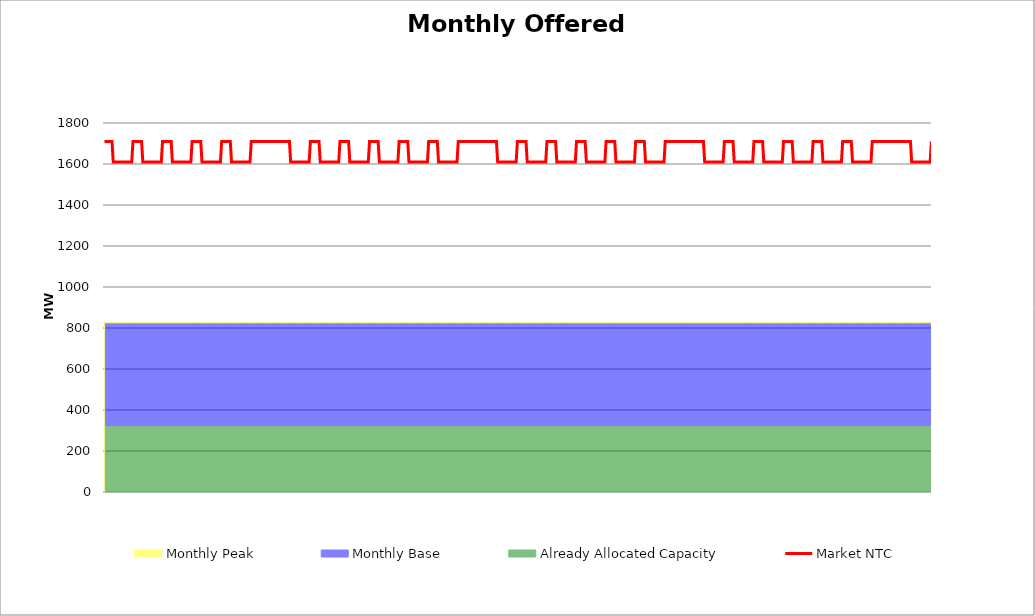
| Category | Market NTC |
|---|---|
| 0 | 1710 |
| 1 | 1710 |
| 2 | 1710 |
| 3 | 1710 |
| 4 | 1710 |
| 5 | 1710 |
| 6 | 1710 |
| 7 | 1610 |
| 8 | 1610 |
| 9 | 1610 |
| 10 | 1610 |
| 11 | 1610 |
| 12 | 1610 |
| 13 | 1610 |
| 14 | 1610 |
| 15 | 1610 |
| 16 | 1610 |
| 17 | 1610 |
| 18 | 1610 |
| 19 | 1610 |
| 20 | 1610 |
| 21 | 1610 |
| 22 | 1610 |
| 23 | 1710 |
| 24 | 1710 |
| 25 | 1710 |
| 26 | 1710 |
| 27 | 1710 |
| 28 | 1710 |
| 29 | 1710 |
| 30 | 1710 |
| 31 | 1610 |
| 32 | 1610 |
| 33 | 1610 |
| 34 | 1610 |
| 35 | 1610 |
| 36 | 1610 |
| 37 | 1610 |
| 38 | 1610 |
| 39 | 1610 |
| 40 | 1610 |
| 41 | 1610 |
| 42 | 1610 |
| 43 | 1610 |
| 44 | 1610 |
| 45 | 1610 |
| 46 | 1610 |
| 47 | 1710 |
| 48 | 1710 |
| 49 | 1710 |
| 50 | 1710 |
| 51 | 1710 |
| 52 | 1710 |
| 53 | 1710 |
| 54 | 1710 |
| 55 | 1610 |
| 56 | 1610 |
| 57 | 1610 |
| 58 | 1610 |
| 59 | 1610 |
| 60 | 1610 |
| 61 | 1610 |
| 62 | 1610 |
| 63 | 1610 |
| 64 | 1610 |
| 65 | 1610 |
| 66 | 1610 |
| 67 | 1610 |
| 68 | 1610 |
| 69 | 1610 |
| 70 | 1610 |
| 71 | 1710 |
| 72 | 1710 |
| 73 | 1710 |
| 74 | 1710 |
| 75 | 1710 |
| 76 | 1710 |
| 77 | 1710 |
| 78 | 1710 |
| 79 | 1610 |
| 80 | 1610 |
| 81 | 1610 |
| 82 | 1610 |
| 83 | 1610 |
| 84 | 1610 |
| 85 | 1610 |
| 86 | 1610 |
| 87 | 1610 |
| 88 | 1610 |
| 89 | 1610 |
| 90 | 1610 |
| 91 | 1610 |
| 92 | 1610 |
| 93 | 1610 |
| 94 | 1610 |
| 95 | 1710 |
| 96 | 1710 |
| 97 | 1710 |
| 98 | 1710 |
| 99 | 1710 |
| 100 | 1710 |
| 101 | 1710 |
| 102 | 1710 |
| 103 | 1610 |
| 104 | 1610 |
| 105 | 1610 |
| 106 | 1610 |
| 107 | 1610 |
| 108 | 1610 |
| 109 | 1610 |
| 110 | 1610 |
| 111 | 1610 |
| 112 | 1610 |
| 113 | 1610 |
| 114 | 1610 |
| 115 | 1610 |
| 116 | 1610 |
| 117 | 1610 |
| 118 | 1610 |
| 119 | 1710 |
| 120 | 1710 |
| 121 | 1710 |
| 122 | 1710 |
| 123 | 1710 |
| 124 | 1710 |
| 125 | 1710 |
| 126 | 1710 |
| 127 | 1710 |
| 128 | 1710 |
| 129 | 1710 |
| 130 | 1710 |
| 131 | 1710 |
| 132 | 1710 |
| 133 | 1710 |
| 134 | 1710 |
| 135 | 1710 |
| 136 | 1710 |
| 137 | 1710 |
| 138 | 1710 |
| 139 | 1710 |
| 140 | 1710 |
| 141 | 1710 |
| 142 | 1710 |
| 143 | 1710 |
| 144 | 1710 |
| 145 | 1710 |
| 146 | 1710 |
| 147 | 1710 |
| 148 | 1710 |
| 149 | 1710 |
| 150 | 1710 |
| 151 | 1610 |
| 152 | 1610 |
| 153 | 1610 |
| 154 | 1610 |
| 155 | 1610 |
| 156 | 1610 |
| 157 | 1610 |
| 158 | 1610 |
| 159 | 1610 |
| 160 | 1610 |
| 161 | 1610 |
| 162 | 1610 |
| 163 | 1610 |
| 164 | 1610 |
| 165 | 1610 |
| 166 | 1610 |
| 167 | 1710 |
| 168 | 1710 |
| 169 | 1710 |
| 170 | 1710 |
| 171 | 1710 |
| 172 | 1710 |
| 173 | 1710 |
| 174 | 1710 |
| 175 | 1610 |
| 176 | 1610 |
| 177 | 1610 |
| 178 | 1610 |
| 179 | 1610 |
| 180 | 1610 |
| 181 | 1610 |
| 182 | 1610 |
| 183 | 1610 |
| 184 | 1610 |
| 185 | 1610 |
| 186 | 1610 |
| 187 | 1610 |
| 188 | 1610 |
| 189 | 1610 |
| 190 | 1610 |
| 191 | 1710 |
| 192 | 1710 |
| 193 | 1710 |
| 194 | 1710 |
| 195 | 1710 |
| 196 | 1710 |
| 197 | 1710 |
| 198 | 1710 |
| 199 | 1610 |
| 200 | 1610 |
| 201 | 1610 |
| 202 | 1610 |
| 203 | 1610 |
| 204 | 1610 |
| 205 | 1610 |
| 206 | 1610 |
| 207 | 1610 |
| 208 | 1610 |
| 209 | 1610 |
| 210 | 1610 |
| 211 | 1610 |
| 212 | 1610 |
| 213 | 1610 |
| 214 | 1610 |
| 215 | 1710 |
| 216 | 1710 |
| 217 | 1710 |
| 218 | 1710 |
| 219 | 1710 |
| 220 | 1710 |
| 221 | 1710 |
| 222 | 1710 |
| 223 | 1610 |
| 224 | 1610 |
| 225 | 1610 |
| 226 | 1610 |
| 227 | 1610 |
| 228 | 1610 |
| 229 | 1610 |
| 230 | 1610 |
| 231 | 1610 |
| 232 | 1610 |
| 233 | 1610 |
| 234 | 1610 |
| 235 | 1610 |
| 236 | 1610 |
| 237 | 1610 |
| 238 | 1610 |
| 239 | 1710 |
| 240 | 1710 |
| 241 | 1710 |
| 242 | 1710 |
| 243 | 1710 |
| 244 | 1710 |
| 245 | 1710 |
| 246 | 1710 |
| 247 | 1610 |
| 248 | 1610 |
| 249 | 1610 |
| 250 | 1610 |
| 251 | 1610 |
| 252 | 1610 |
| 253 | 1610 |
| 254 | 1610 |
| 255 | 1610 |
| 256 | 1610 |
| 257 | 1610 |
| 258 | 1610 |
| 259 | 1610 |
| 260 | 1610 |
| 261 | 1610 |
| 262 | 1610 |
| 263 | 1710 |
| 264 | 1710 |
| 265 | 1710 |
| 266 | 1710 |
| 267 | 1710 |
| 268 | 1710 |
| 269 | 1710 |
| 270 | 1710 |
| 271 | 1610 |
| 272 | 1610 |
| 273 | 1610 |
| 274 | 1610 |
| 275 | 1610 |
| 276 | 1610 |
| 277 | 1610 |
| 278 | 1610 |
| 279 | 1610 |
| 280 | 1610 |
| 281 | 1610 |
| 282 | 1610 |
| 283 | 1610 |
| 284 | 1610 |
| 285 | 1610 |
| 286 | 1610 |
| 287 | 1710 |
| 288 | 1710 |
| 289 | 1710 |
| 290 | 1710 |
| 291 | 1710 |
| 292 | 1710 |
| 293 | 1710 |
| 294 | 1710 |
| 295 | 1710 |
| 296 | 1710 |
| 297 | 1710 |
| 298 | 1710 |
| 299 | 1710 |
| 300 | 1710 |
| 301 | 1710 |
| 302 | 1710 |
| 303 | 1710 |
| 304 | 1710 |
| 305 | 1710 |
| 306 | 1710 |
| 307 | 1710 |
| 308 | 1710 |
| 309 | 1710 |
| 310 | 1710 |
| 311 | 1710 |
| 312 | 1710 |
| 313 | 1710 |
| 314 | 1710 |
| 315 | 1710 |
| 316 | 1710 |
| 317 | 1710 |
| 318 | 1710 |
| 319 | 1610 |
| 320 | 1610 |
| 321 | 1610 |
| 322 | 1610 |
| 323 | 1610 |
| 324 | 1610 |
| 325 | 1610 |
| 326 | 1610 |
| 327 | 1610 |
| 328 | 1610 |
| 329 | 1610 |
| 330 | 1610 |
| 331 | 1610 |
| 332 | 1610 |
| 333 | 1610 |
| 334 | 1610 |
| 335 | 1710 |
| 336 | 1710 |
| 337 | 1710 |
| 338 | 1710 |
| 339 | 1710 |
| 340 | 1710 |
| 341 | 1710 |
| 342 | 1710 |
| 343 | 1610 |
| 344 | 1610 |
| 345 | 1610 |
| 346 | 1610 |
| 347 | 1610 |
| 348 | 1610 |
| 349 | 1610 |
| 350 | 1610 |
| 351 | 1610 |
| 352 | 1610 |
| 353 | 1610 |
| 354 | 1610 |
| 355 | 1610 |
| 356 | 1610 |
| 357 | 1610 |
| 358 | 1610 |
| 359 | 1710 |
| 360 | 1710 |
| 361 | 1710 |
| 362 | 1710 |
| 363 | 1710 |
| 364 | 1710 |
| 365 | 1710 |
| 366 | 1710 |
| 367 | 1610 |
| 368 | 1610 |
| 369 | 1610 |
| 370 | 1610 |
| 371 | 1610 |
| 372 | 1610 |
| 373 | 1610 |
| 374 | 1610 |
| 375 | 1610 |
| 376 | 1610 |
| 377 | 1610 |
| 378 | 1610 |
| 379 | 1610 |
| 380 | 1610 |
| 381 | 1610 |
| 382 | 1610 |
| 383 | 1710 |
| 384 | 1710 |
| 385 | 1710 |
| 386 | 1710 |
| 387 | 1710 |
| 388 | 1710 |
| 389 | 1710 |
| 390 | 1710 |
| 391 | 1610 |
| 392 | 1610 |
| 393 | 1610 |
| 394 | 1610 |
| 395 | 1610 |
| 396 | 1610 |
| 397 | 1610 |
| 398 | 1610 |
| 399 | 1610 |
| 400 | 1610 |
| 401 | 1610 |
| 402 | 1610 |
| 403 | 1610 |
| 404 | 1610 |
| 405 | 1610 |
| 406 | 1610 |
| 407 | 1710 |
| 408 | 1710 |
| 409 | 1710 |
| 410 | 1710 |
| 411 | 1710 |
| 412 | 1710 |
| 413 | 1710 |
| 414 | 1710 |
| 415 | 1610 |
| 416 | 1610 |
| 417 | 1610 |
| 418 | 1610 |
| 419 | 1610 |
| 420 | 1610 |
| 421 | 1610 |
| 422 | 1610 |
| 423 | 1610 |
| 424 | 1610 |
| 425 | 1610 |
| 426 | 1610 |
| 427 | 1610 |
| 428 | 1610 |
| 429 | 1610 |
| 430 | 1610 |
| 431 | 1710 |
| 432 | 1710 |
| 433 | 1710 |
| 434 | 1710 |
| 435 | 1710 |
| 436 | 1710 |
| 437 | 1710 |
| 438 | 1710 |
| 439 | 1610 |
| 440 | 1610 |
| 441 | 1610 |
| 442 | 1610 |
| 443 | 1610 |
| 444 | 1610 |
| 445 | 1610 |
| 446 | 1610 |
| 447 | 1610 |
| 448 | 1610 |
| 449 | 1610 |
| 450 | 1610 |
| 451 | 1610 |
| 452 | 1610 |
| 453 | 1610 |
| 454 | 1610 |
| 455 | 1710 |
| 456 | 1710 |
| 457 | 1710 |
| 458 | 1710 |
| 459 | 1710 |
| 460 | 1710 |
| 461 | 1710 |
| 462 | 1710 |
| 463 | 1710 |
| 464 | 1710 |
| 465 | 1710 |
| 466 | 1710 |
| 467 | 1710 |
| 468 | 1710 |
| 469 | 1710 |
| 470 | 1710 |
| 471 | 1710 |
| 472 | 1710 |
| 473 | 1710 |
| 474 | 1710 |
| 475 | 1710 |
| 476 | 1710 |
| 477 | 1710 |
| 478 | 1710 |
| 479 | 1710 |
| 480 | 1710 |
| 481 | 1710 |
| 482 | 1710 |
| 483 | 1710 |
| 484 | 1710 |
| 485 | 1710 |
| 486 | 1710 |
| 487 | 1610 |
| 488 | 1610 |
| 489 | 1610 |
| 490 | 1610 |
| 491 | 1610 |
| 492 | 1610 |
| 493 | 1610 |
| 494 | 1610 |
| 495 | 1610 |
| 496 | 1610 |
| 497 | 1610 |
| 498 | 1610 |
| 499 | 1610 |
| 500 | 1610 |
| 501 | 1610 |
| 502 | 1610 |
| 503 | 1710 |
| 504 | 1710 |
| 505 | 1710 |
| 506 | 1710 |
| 507 | 1710 |
| 508 | 1710 |
| 509 | 1710 |
| 510 | 1710 |
| 511 | 1610 |
| 512 | 1610 |
| 513 | 1610 |
| 514 | 1610 |
| 515 | 1610 |
| 516 | 1610 |
| 517 | 1610 |
| 518 | 1610 |
| 519 | 1610 |
| 520 | 1610 |
| 521 | 1610 |
| 522 | 1610 |
| 523 | 1610 |
| 524 | 1610 |
| 525 | 1610 |
| 526 | 1610 |
| 527 | 1710 |
| 528 | 1710 |
| 529 | 1710 |
| 530 | 1710 |
| 531 | 1710 |
| 532 | 1710 |
| 533 | 1710 |
| 534 | 1710 |
| 535 | 1610 |
| 536 | 1610 |
| 537 | 1610 |
| 538 | 1610 |
| 539 | 1610 |
| 540 | 1610 |
| 541 | 1610 |
| 542 | 1610 |
| 543 | 1610 |
| 544 | 1610 |
| 545 | 1610 |
| 546 | 1610 |
| 547 | 1610 |
| 548 | 1610 |
| 549 | 1610 |
| 550 | 1610 |
| 551 | 1710 |
| 552 | 1710 |
| 553 | 1710 |
| 554 | 1710 |
| 555 | 1710 |
| 556 | 1710 |
| 557 | 1710 |
| 558 | 1710 |
| 559 | 1610 |
| 560 | 1610 |
| 561 | 1610 |
| 562 | 1610 |
| 563 | 1610 |
| 564 | 1610 |
| 565 | 1610 |
| 566 | 1610 |
| 567 | 1610 |
| 568 | 1610 |
| 569 | 1610 |
| 570 | 1610 |
| 571 | 1610 |
| 572 | 1610 |
| 573 | 1610 |
| 574 | 1610 |
| 575 | 1710 |
| 576 | 1710 |
| 577 | 1710 |
| 578 | 1710 |
| 579 | 1710 |
| 580 | 1710 |
| 581 | 1710 |
| 582 | 1710 |
| 583 | 1610 |
| 584 | 1610 |
| 585 | 1610 |
| 586 | 1610 |
| 587 | 1610 |
| 588 | 1610 |
| 589 | 1610 |
| 590 | 1610 |
| 591 | 1610 |
| 592 | 1610 |
| 593 | 1610 |
| 594 | 1610 |
| 595 | 1610 |
| 596 | 1610 |
| 597 | 1610 |
| 598 | 1610 |
| 599 | 1710 |
| 600 | 1710 |
| 601 | 1710 |
| 602 | 1710 |
| 603 | 1710 |
| 604 | 1710 |
| 605 | 1710 |
| 606 | 1710 |
| 607 | 1610 |
| 608 | 1610 |
| 609 | 1610 |
| 610 | 1610 |
| 611 | 1610 |
| 612 | 1610 |
| 613 | 1610 |
| 614 | 1610 |
| 615 | 1610 |
| 616 | 1610 |
| 617 | 1610 |
| 618 | 1610 |
| 619 | 1610 |
| 620 | 1610 |
| 621 | 1610 |
| 622 | 1610 |
| 623 | 1710 |
| 624 | 1710 |
| 625 | 1710 |
| 626 | 1710 |
| 627 | 1710 |
| 628 | 1710 |
| 629 | 1710 |
| 630 | 1710 |
| 631 | 1710 |
| 632 | 1710 |
| 633 | 1710 |
| 634 | 1710 |
| 635 | 1710 |
| 636 | 1710 |
| 637 | 1710 |
| 638 | 1710 |
| 639 | 1710 |
| 640 | 1710 |
| 641 | 1710 |
| 642 | 1710 |
| 643 | 1710 |
| 644 | 1710 |
| 645 | 1710 |
| 646 | 1710 |
| 647 | 1710 |
| 648 | 1710 |
| 649 | 1710 |
| 650 | 1710 |
| 651 | 1710 |
| 652 | 1710 |
| 653 | 1710 |
| 654 | 1710 |
| 655 | 1610 |
| 656 | 1610 |
| 657 | 1610 |
| 658 | 1610 |
| 659 | 1610 |
| 660 | 1610 |
| 661 | 1610 |
| 662 | 1610 |
| 663 | 1610 |
| 664 | 1610 |
| 665 | 1610 |
| 666 | 1610 |
| 667 | 1610 |
| 668 | 1610 |
| 669 | 1610 |
| 670 | 1610 |
| 671 | 1710 |